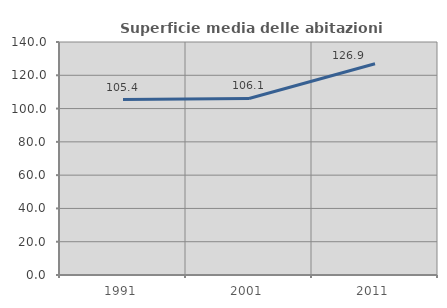
| Category | Superficie media delle abitazioni occupate |
|---|---|
| 1991.0 | 105.441 |
| 2001.0 | 106.063 |
| 2011.0 | 126.938 |